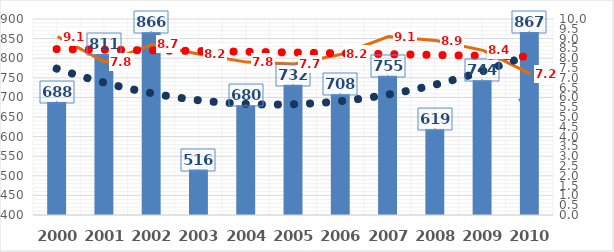
| Category | srážky [mm] |
|---|---|
| 2000.0 | 688 |
| 2001.0 | 811 |
| 2002.0 | 866 |
| 2003.0 | 516 |
| 2004.0 | 680 |
| 2005.0 | 732 |
| 2006.0 | 708 |
| 2007.0 | 755 |
| 2008.0 | 619 |
| 2009.0 | 744 |
| 2010.0 | 867 |